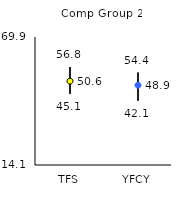
| Category | 25th | 75th | Mean |
|---|---|---|---|
| TFS | 45.1 | 56.8 | 50.64 |
| YFCY | 42.1 | 54.4 | 48.86 |